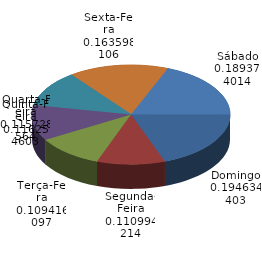
| Category | Qtde Vítimas |
|---|---|
| Domingo | 370 |
| Segunda-Feira | 211 |
| Terça-Feira | 208 |
| Quarta-Feira | 220 |
| Quinta-Feira | 221 |
| Sexta-Feira | 311 |
| Sábado | 360 |